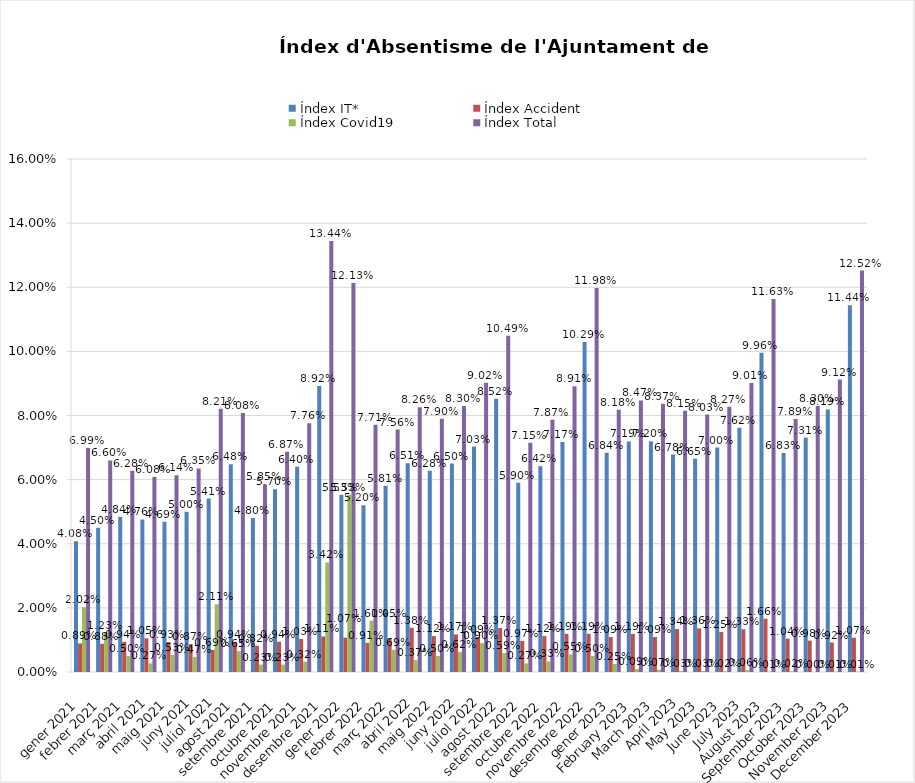
| Category | Índex IT* | Índex Accident | Índex Covid19 | Índex Total |
|---|---|---|---|---|
| 0 | 0.041 | 0.009 | 0.02 | 0.07 |
| 1 | 0.045 | 0.009 | 0.012 | 0.066 |
| 2 | 0.048 | 0.009 | 0.005 | 0.063 |
| 3 | 0.048 | 0.01 | 0.003 | 0.061 |
| 4 | 0.047 | 0.009 | 0.005 | 0.061 |
| 5 | 0.05 | 0.009 | 0.005 | 0.064 |
| 6 | 0.054 | 0.007 | 0.021 | 0.082 |
| 7 | 0.065 | 0.009 | 0.006 | 0.081 |
| 8 | 0.048 | 0.008 | 0.002 | 0.058 |
| 9 | 0.057 | 0.009 | 0.002 | 0.069 |
| 10 | 0.064 | 0.01 | 0.003 | 0.078 |
| 11 | 0.089 | 0.011 | 0.034 | 0.134 |
| 12 | 0.055 | 0.011 | 0.055 | 0.121 |
| 13 | 0.052 | 0.009 | 0.016 | 0.077 |
| 14 | 0.058 | 0.01 | 0.007 | 0.076 |
| 15 | 0.065 | 0.014 | 0.004 | 0.083 |
| 16 | 0.063 | 0.011 | 0.005 | 0.079 |
| 17 | 0.065 | 0.012 | 0.006 | 0.083 |
| 18 | 0.07 | 0.011 | 0.009 | 0.09 |
| 19 | 0.085 | 0.014 | 0.006 | 0.105 |
| 20 | 0.059 | 0.01 | 0.003 | 0.072 |
| 21 | 0.064 | 0.011 | 0.003 | 0.079 |
| 22 | 0.072 | 0.012 | 0.006 | 0.089 |
| 23 | 0.103 | 0.012 | 0.005 | 0.12 |
| 24 | 0.068 | 0.011 | 0.002 | 0.082 |
| 25 | 0.072 | 0.012 | 0.001 | 0.085 |
| 26 | 0.072 | 0.011 | 0.001 | 0.084 |
| 27 | 0.068 | 0.013 | 0 | 0.082 |
| 28 | 0.066 | 0.014 | 0 | 0.08 |
| 29 | 0.07 | 0.012 | 0 | 0.083 |
| 30 | 0.076 | 0.013 | 0.001 | 0.09 |
| 31 | 0.1 | 0.017 | 0 | 0.116 |
| 32 | 0.068 | 0.01 | 0 | 0.079 |
| 33 | 0.073 | 0.01 | 0 | 0.083 |
| 34 | 0.082 | 0.009 | 0 | 0.091 |
| 35 | 0.114 | 0.011 | 0 | 0.125 |